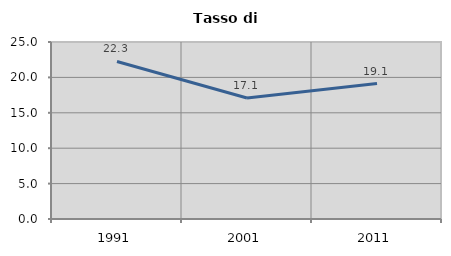
| Category | Tasso di disoccupazione   |
|---|---|
| 1991.0 | 22.252 |
| 2001.0 | 17.085 |
| 2011.0 | 19.127 |